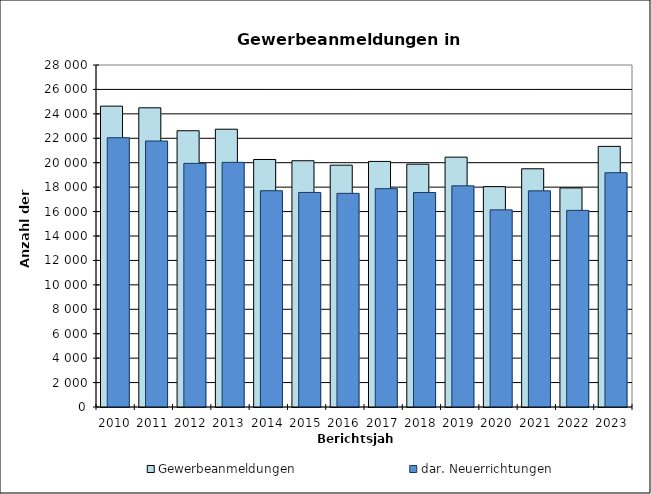
| Category | Gewerbeanmeldungen | dar. Neuerrichtungen |
|---|---|---|
| 2010.0 | 24632 | 22046 |
| 2011.0 | 24495 | 21777 |
| 2012.0 | 22618 | 19945 |
| 2013.0 | 22743 | 20029 |
| 2014.0 | 20264 | 17706 |
| 2015.0 | 20162 | 17566 |
| 2016.0 | 19798 | 17492 |
| 2017.0 | 20105 | 17874 |
| 2018.0 | 19880 | 17558 |
| 2019.0 | 20454 | 18108 |
| 2020.0 | 18040 | 16141 |
| 2021.0 | 19504 | 17696 |
| 2022.0 | 17935 | 16098 |
| 2023.0 | 21338 | 19180 |